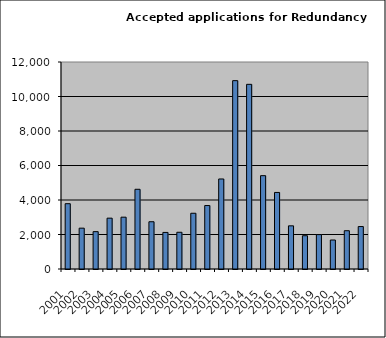
| Category | Series 0 |
|---|---|
| 2001.0 | 3786 |
| 2002.0 | 2367 |
| 2003.0 | 2165 |
| 2004.0 | 2947 |
| 2005.0 | 3004 |
| 2006.0 | 4621 |
| 2007.0 | 2740 |
| 2008.0 | 2120 |
| 2009.0 | 2129 |
| 2010.0 | 3231 |
| 2011.0 | 3679 |
| 2012.0 | 5219 |
| 2013.0 | 10919 |
| 2014.0 | 10705 |
| 2015.0 | 5411 |
| 2016.0 | 4438 |
| 2017.0 | 2502 |
| 2018.0 | 1930 |
| 2019.0 | 1994 |
| 2020.0 | 1681 |
| 2021.0 | 2220 |
| 2022.0 | 2461 |